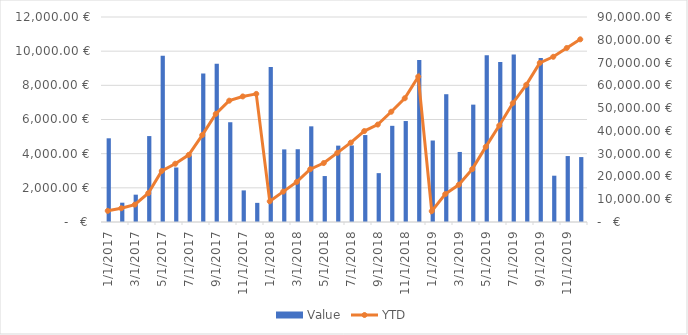
| Category | Value |
|---|---|
| 1/1/17 | 4900 |
| 2/1/17 | 1130 |
| 3/1/17 | 1600 |
| 4/1/17 | 5030 |
| 5/1/17 | 9730 |
| 6/1/17 | 3190 |
| 7/1/17 | 3890 |
| 8/1/17 | 8700 |
| 9/1/17 | 9260 |
| 10/1/17 | 5840 |
| 11/1/17 | 1850 |
| 12/1/17 | 1120 |
| 1/1/18 | 9080 |
| 2/1/18 | 4250 |
| 3/1/18 | 4260 |
| 4/1/18 | 5600 |
| 5/1/18 | 2690 |
| 6/1/18 | 4470 |
| 7/1/18 | 4480 |
| 8/1/18 | 5090 |
| 9/1/18 | 2860 |
| 10/1/18 | 5630 |
| 11/1/18 | 5910 |
| 12/1/18 | 9490 |
| 1/1/19 | 4770 |
| 2/1/19 | 7480 |
| 3/1/19 | 4100 |
| 4/1/19 | 6870 |
| 5/1/19 | 9760 |
| 6/1/19 | 9360 |
| 7/1/19 | 9800 |
| 8/1/19 | 8080 |
| 9/1/19 | 9600 |
| 10/1/19 | 2710 |
| 11/1/19 | 3860 |
| 12/1/19 | 3800 |